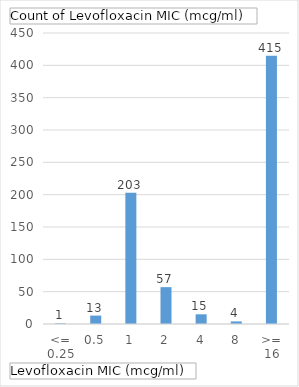
| Category | Total |
|---|---|
| <= 0.25 | 1 |
| 0.5 | 13 |
| 1 | 203 |
| 2 | 57 |
| 4 | 15 |
| 8 | 4 |
| >= 16 | 415 |